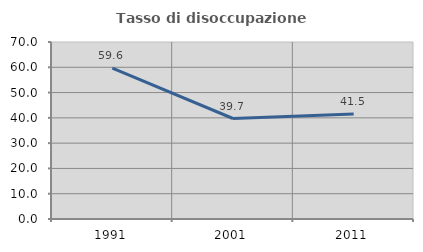
| Category | Tasso di disoccupazione giovanile  |
|---|---|
| 1991.0 | 59.624 |
| 2001.0 | 39.744 |
| 2011.0 | 41.538 |